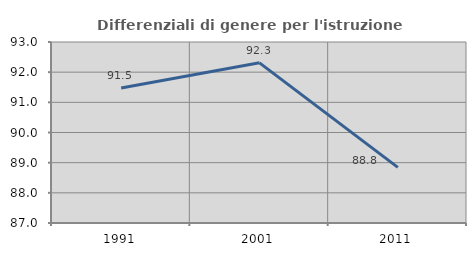
| Category | Differenziali di genere per l'istruzione superiore |
|---|---|
| 1991.0 | 91.472 |
| 2001.0 | 92.31 |
| 2011.0 | 88.843 |